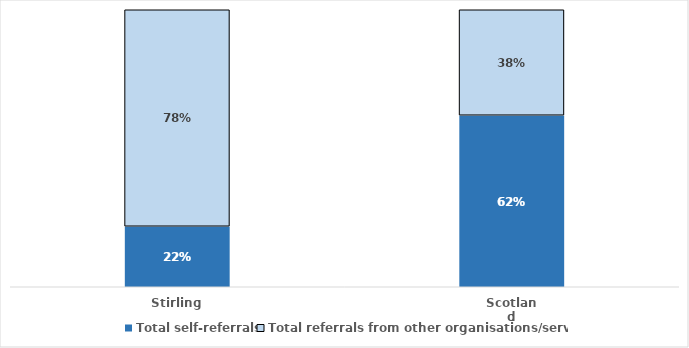
| Category | Total self-referrals | Total referrals from other organisations/services |
|---|---|---|
| Stirling | 0.218 | 0.782 |
| Scotland | 0.619 | 0.381 |